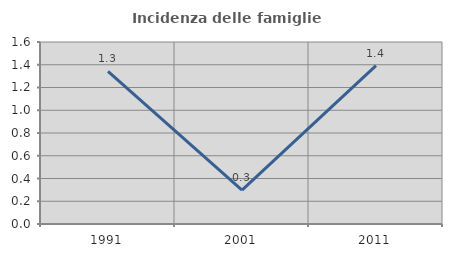
| Category | Incidenza delle famiglie numerose |
|---|---|
| 1991.0 | 1.342 |
| 2001.0 | 0.299 |
| 2011.0 | 1.392 |